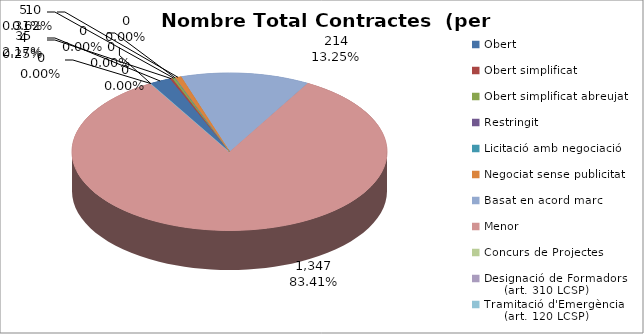
| Category | Nombre Total Contractes |
|---|---|
| Obert | 35 |
| Obert simplificat | 4 |
| Obert simplificat abreujat | 5 |
| Restringit | 0 |
| Licitació amb negociació | 0 |
| Negociat sense publicitat | 10 |
| Basat en acord marc | 214 |
| Menor | 1347 |
| Concurs de Projectes | 0 |
| Designació de Formadors
     (art. 310 LCSP) | 0 |
| Tramitació d'Emergència
     (art. 120 LCSP) | 0 |